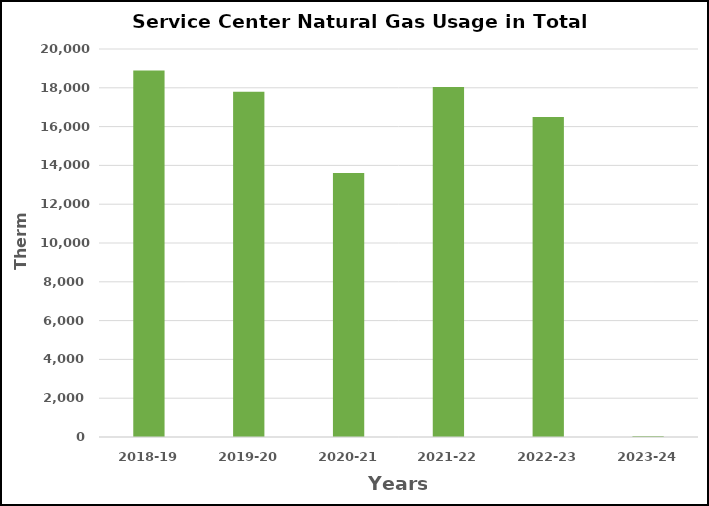
| Category | Series 0 |
|---|---|
| 2018-19 | 18888 |
| 2019-20 | 17799 |
| 2020-21 | 13612 |
| 2021-22 | 18041 |
| 2022-23 | 16501 |
| 2023-24 | 45 |